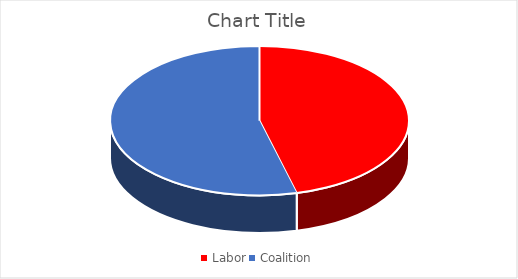
| Category | Series 0 |
|---|---|
| Labor | 23 |
| Coalition | 27 |